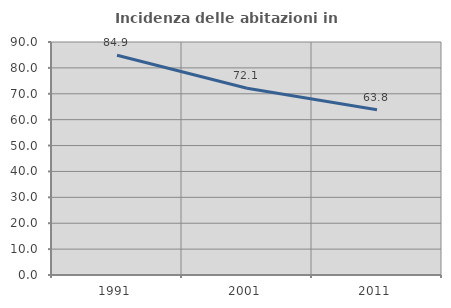
| Category | Incidenza delle abitazioni in proprietà  |
|---|---|
| 1991.0 | 84.855 |
| 2001.0 | 72.119 |
| 2011.0 | 63.81 |